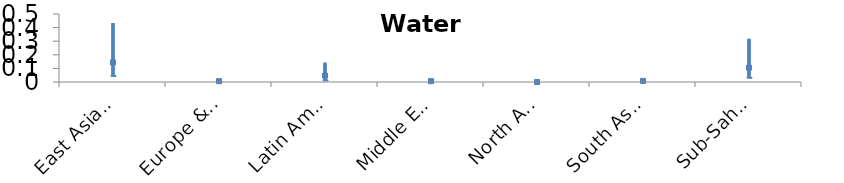
| Category | Worst | Best | Central |
|---|---|---|---|
| East Asia & Pacific | 0.433 | 0.048 | 0.144 |
| Europe & Central Asia | 0.018 | 0.002 | 0.006 |
| Latin America & Caribbean | 0.141 | 0.016 | 0.047 |
| Middle East & North Africa | 0.018 | 0.002 | 0.006 |
| North America | 0 | 0 | 0 |
| South Asia | 0.023 | 0.003 | 0.008 |
| Sub-Saharan Africa | 0.317 | 0.035 | 0.106 |